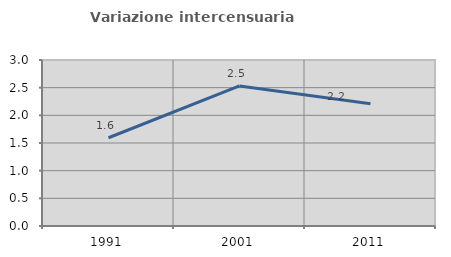
| Category | Variazione intercensuaria annua |
|---|---|
| 1991.0 | 1.595 |
| 2001.0 | 2.531 |
| 2011.0 | 2.209 |